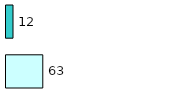
| Category | Series 0 | Series 1 |
|---|---|---|
| 0 | 63 | 12 |